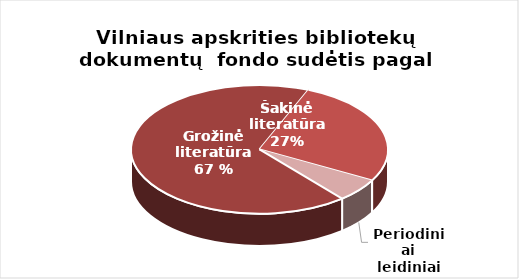
| Category | Series 0 |
|---|---|
| Grožinė literatūra* | 1248750 |
| Šakinė literatūra* | 496774 |
| Periodiniai leidiniai | 109105 |